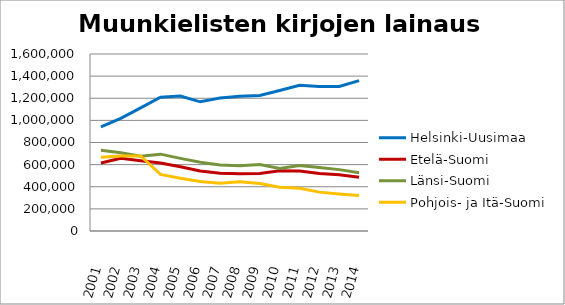
| Category | Helsinki-Uusimaa | Etelä-Suomi | Länsi-Suomi | Pohjois- ja Itä-Suomi |
|---|---|---|---|---|
| 2001.0 | 941663 | 615230 | 729231 | 667393 |
| 2002.0 | 1018955 | 657041 | 706916 | 677759 |
| 2003.0 | 1113489 | 634354 | 676669 | 677840 |
| 2004.0 | 1209630 | 614916 | 694661 | 511975 |
| 2005.0 | 1220505 | 580032 | 656678 | 477463 |
| 2006.0 | 1167781 | 543337 | 621388 | 447061 |
| 2007.0 | 1201408 | 521721 | 597140 | 431728 |
| 2008.0 | 1217981 | 517261 | 588785 | 444093 |
| 2009.0 | 1224191 | 520035 | 601448 | 428527 |
| 2010.0 | 1269367 | 544310 | 565588 | 395636 |
| 2011.0 | 1317094 | 543093 | 591400 | 386041 |
| 2012.0 | 1306142 | 520039 | 573756 | 351405 |
| 2013.0 | 1306497 | 509288 | 554780 | 334218 |
| 2014.0 | 1359085 | 486512 | 526846 | 320216 |